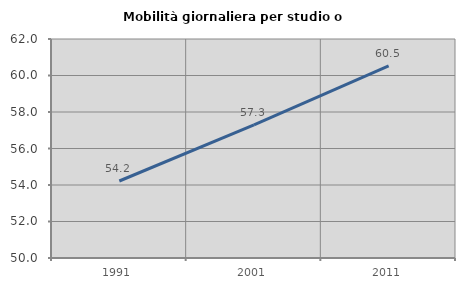
| Category | Mobilità giornaliera per studio o lavoro |
|---|---|
| 1991.0 | 54.219 |
| 2001.0 | 57.29 |
| 2011.0 | 60.522 |